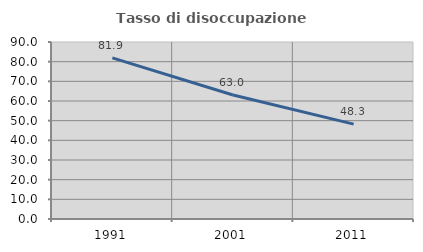
| Category | Tasso di disoccupazione giovanile  |
|---|---|
| 1991.0 | 81.899 |
| 2001.0 | 63.039 |
| 2011.0 | 48.256 |